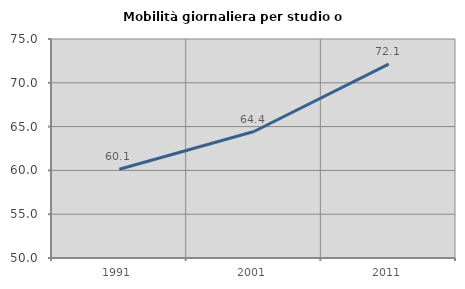
| Category | Mobilità giornaliera per studio o lavoro |
|---|---|
| 1991.0 | 60.13 |
| 2001.0 | 64.439 |
| 2011.0 | 72.139 |